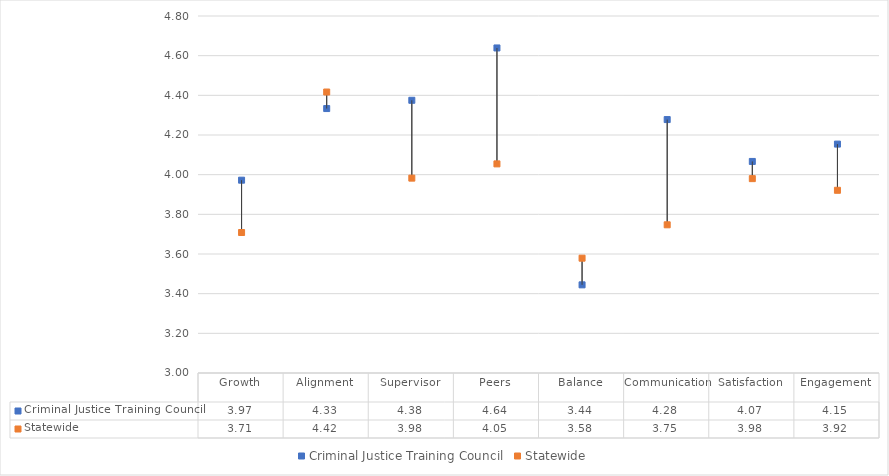
| Category | Criminal Justice Training Council | Statewide |
|---|---|---|
| Growth | 3.972 | 3.708 |
| Alignment | 4.333 | 4.417 |
| Supervisor | 4.375 | 3.983 |
| Peers | 4.639 | 4.054 |
| Balance | 3.444 | 3.579 |
| Communication | 4.278 | 3.747 |
| Satisfaction | 4.067 | 3.98 |
| Engagement | 4.154 | 3.921 |